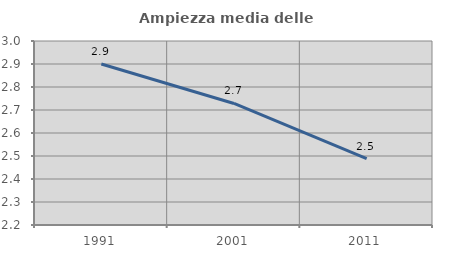
| Category | Ampiezza media delle famiglie |
|---|---|
| 1991.0 | 2.9 |
| 2001.0 | 2.728 |
| 2011.0 | 2.488 |